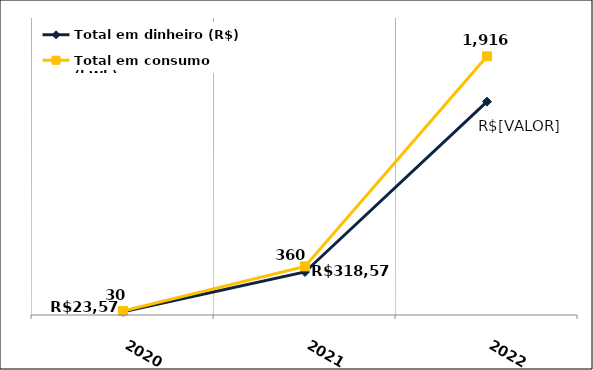
| Category | Total em dinheiro (R$) |
|---|---|
| 2020.0 | 23.57 |
| 2021.0 | 318.57 |
| 2022.0 | 1580.32 |